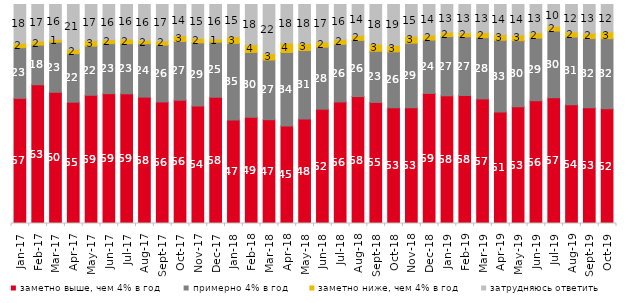
| Category | заметно выше, чем 4% в год | примерно 4% в год | заметно ниже, чем 4% в год | затрудняюсь ответить |
|---|---|---|---|---|
| 2017-01-01 | 57.15 | 23.15 | 2 | 17.7 |
| 2017-02-01 | 63.35 | 18.1 | 1.9 | 16.65 |
| 2017-03-01 | 59.9 | 22.9 | 1.25 | 15.95 |
| 2017-04-01 | 55.35 | 22.15 | 1.95 | 20.5 |
| 2017-05-01 | 58.55 | 22.45 | 2.5 | 16.5 |
| 2017-06-01 | 59.25 | 22.85 | 1.8 | 16.05 |
| 2017-07-01 | 59.2 | 22.85 | 2.1 | 15.8 |
| 2017-08-01 | 57.7 | 24.4 | 1.55 | 16.35 |
| 2017-09-01 | 55.5 | 25.95 | 1.95 | 16.6 |
| 2017-10-01 | 56.3 | 26.8 | 2.65 | 14.25 |
| 2017-11-01 | 53.6 | 28.9 | 2.05 | 15.45 |
| 2017-12-01 | 57.65 | 25.15 | 1.45 | 15.75 |
| 2018-01-01 | 47.25 | 35 | 3 | 14.75 |
| 2018-02-01 | 48.5 | 29.6 | 3.5 | 18.4 |
| 2018-03-01 | 47.4 | 27.25 | 2.9 | 22.45 |
| 2018-04-01 | 44.55 | 33.55 | 4.3 | 17.6 |
| 2018-05-01 | 47.7 | 31.3 | 3.25 | 17.75 |
| 2018-06-01 | 52.2 | 28.3 | 2.4 | 17.1 |
| 2018-07-01 | 55.5 | 26.35 | 2.25 | 15.9 |
| 2018-08-01 | 57.95 | 25.65 | 2.3 | 14.1 |
| 2018-09-01 | 55.3 | 23.35 | 3.25 | 18.1 |
| 2018-10-01 | 52.85 | 25.55 | 2.95 | 18.65 |
| 2018-11-01 | 52.844 | 29.491 | 3.144 | 14.521 |
| 2018-12-01 | 59.4 | 24.35 | 2.35 | 13.9 |
| 2019-01-01 | 58.3 | 27.05 | 2 | 12.65 |
| 2019-02-01 | 58.45 | 26.8 | 1.85 | 12.9 |
| 2019-03-01 | 56.887 | 27.946 | 2.387 | 12.78 |
| 2019-04-01 | 50.891 | 32.772 | 2.574 | 13.762 |
| 2019-05-01 | 53.343 | 30.163 | 2.526 | 13.967 |
| 2019-06-01 | 56.06 | 28.579 | 2.444 | 12.918 |
| 2019-07-01 | 57.475 | 30.396 | 2.228 | 9.901 |
| 2019-08-01 | 54.246 | 30.869 | 2.398 | 12.488 |
| 2019-09-01 | 52.822 | 31.634 | 2.475 | 13.069 |
| 2019-10-01 | 52.426 | 31.98 | 3.119 | 12.475 |